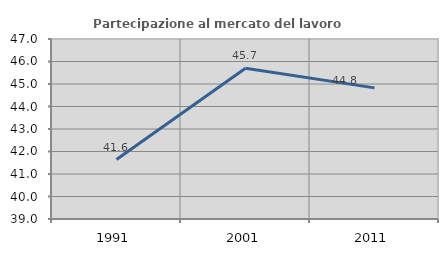
| Category | Partecipazione al mercato del lavoro  femminile |
|---|---|
| 1991.0 | 41.643 |
| 2001.0 | 45.699 |
| 2011.0 | 44.828 |